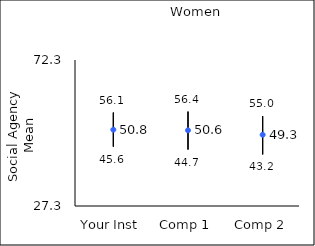
| Category | 25th percentile | 75th percentile | Mean |
|---|---|---|---|
| Your Inst | 45.6 | 56.1 | 50.82 |
| Comp 1 | 44.7 | 56.4 | 50.63 |
| Comp 2 | 43.2 | 55 | 49.26 |